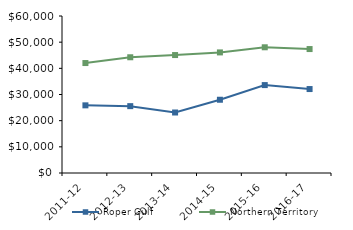
| Category | Roper Gulf | Northern Territory |
|---|---|---|
| 2011-12 | 25855.29 | 42021 |
| 2012-13 | 25550 | 44232.02 |
| 2013-14 | 23121.28 | 45075.51 |
| 2014-15 | 27994.31 | 46083.65 |
| 2015-16 | 33597.5 | 48046.27 |
| 2016-17 | 32081.75 | 47367.05 |